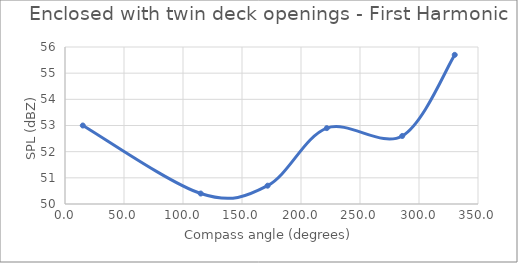
| Category | Series 0 |
|---|---|
| 15.06445125542554 | 53 |
| 115.00449447818254 | 50.4 |
| 171.7068171198818 | 50.7 |
| 221.8691292075067 | 52.9 |
| 285.7828166838848 | 52.6 |
| 330.28010595813004 | 55.7 |